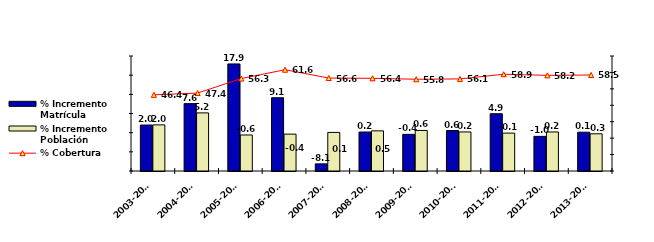
| Category | % Incremento Matrícula | % Incremento Población |
|---|---|---|
| 2005-2006 | 17.932 | -0.607 |
| 2006-2007 | 9.113 | -0.381 |
| 2007-2008 | -8.142 | 0.067 |
| 2008-2009 | 0.166 | 0.472 |
| 2009-2010 | -0.44 | 0.579 |
| 2010-2011 | 0.559 | 0.188 |
| 2011-2012 | 4.938 | -0.119 |
| 2012-2013 | -0.967 | 0.184 |
| 2013-2014 | 0.114 | -0.296 |